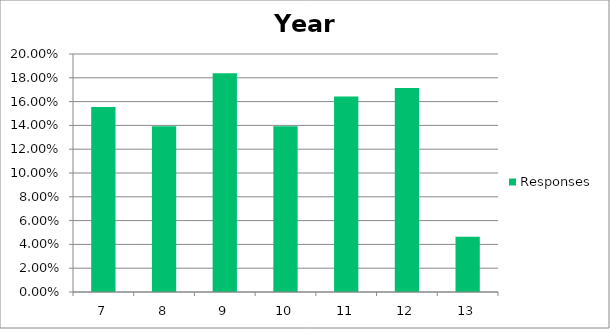
| Category | Responses |
|---|---|
| 7 | 0.155 |
| 8 | 0.139 |
| 9 | 0.184 |
| 10 | 0.139 |
| 11 | 0.164 |
| 12 | 0.171 |
| 13 | 0.046 |